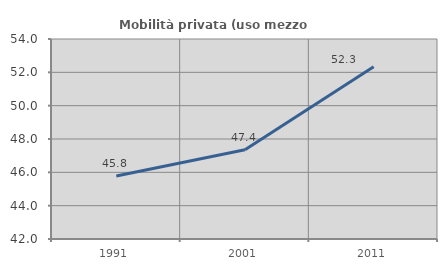
| Category | Mobilità privata (uso mezzo privato) |
|---|---|
| 1991.0 | 45.775 |
| 2001.0 | 47.358 |
| 2011.0 | 52.335 |